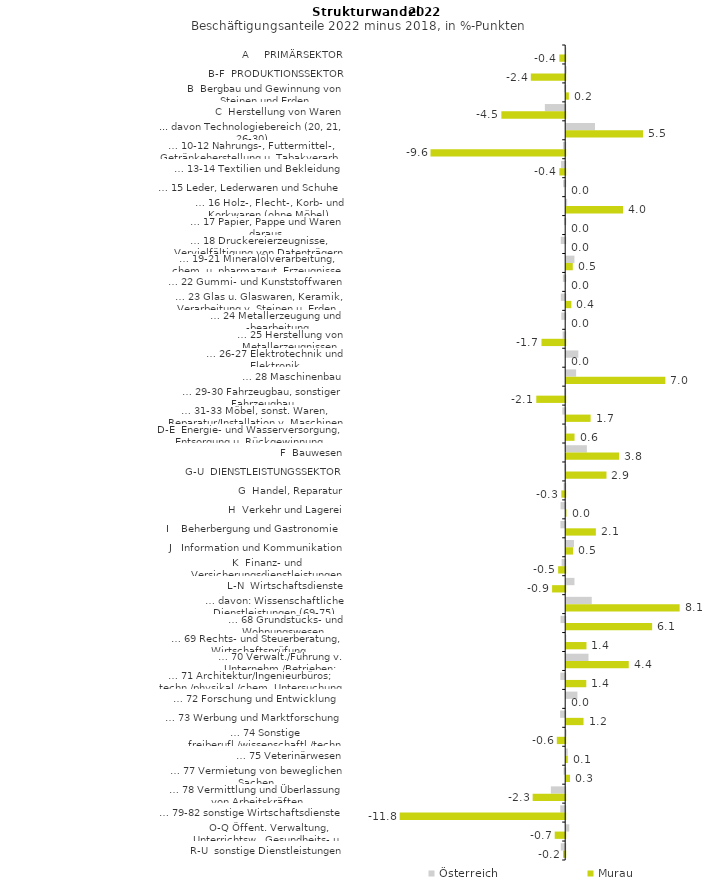
| Category | Österreich | Murau |
|---|---|---|
| A     PRIMÄRSEKTOR | 0.004 | -0.418 |
| B-F  PRODUKTIONSSEKTOR | 0.036 | -2.443 |
| B  Bergbau und Gewinnung von Steinen und Erden | -0.063 | 0.189 |
| C  Herstellung von Waren | -1.445 | -4.534 |
| ... davon Technologiebereich (20, 21, 26-30) | 2.047 | 5.455 |
| … 10-12 Nahrungs-, Futtermittel-, Getränkeherstellung u. Tabakverarb. | -0.163 | -9.565 |
| … 13-14 Textilien und Bekleidung | -0.292 | -0.417 |
| … 15 Leder, Lederwaren und Schuhe | -0.15 | 0 |
| … 16 Holz-, Flecht-, Korb- und Korkwaren (ohne Möbel)  | 0.068 | 4.033 |
| … 17 Papier, Pappe und Waren daraus  | -0.09 | 0 |
| … 18 Druckereierzeugnisse, Vervielfältigung von Datenträgern | -0.314 | 0 |
| … 19-21 Mineralölverarbeitung, chem. u. pharmazeut. Erzeugnisse | 0.584 | 0.467 |
| … 22 Gummi- und Kunststoffwaren | -0.168 | 0 |
| … 23 Glas u. Glaswaren, Keramik, Verarbeitung v. Steinen u. Erden  | -0.312 | 0.366 |
| … 24 Metallerzeugung und -bearbeitung | -0.276 | 0 |
| … 25 Herstellung von Metallerzeugnissen  | -0.185 | -1.684 |
| … 26-27 Elektrotechnik und Elektronik | 0.862 | 0 |
| … 28 Maschinenbau | 0.705 | 7.041 |
| … 29-30 Fahrzeugbau, sonstiger Fahrzeugbau | -0.066 | -2.053 |
| … 31-33 Möbel, sonst. Waren, Reparatur/Installation v. Maschinen | -0.204 | 1.734 |
| D-E  Energie- und Wasserversorgung, Entsorgung u. Rückgewinnung | 0.038 | 0.592 |
| F  Bauwesen | 1.469 | 3.753 |
| G-U  DIENSTLEISTUNGSSEKTOR | -0.04 | 2.861 |
| G  Handel, Reparatur | -0.115 | -0.274 |
| H  Verkehr und Lagerei | -0.33 | 0.022 |
| I    Beherbergung und Gastronomie | -0.34 | 2.106 |
| J   Information und Kommunikation | 0.551 | 0.483 |
| K  Finanz- und Versicherungsdienstleistungen | -0.255 | -0.503 |
| L-N  Wirtschaftsdienste | 0.586 | -0.932 |
| … davon: Wissenschaftliche Dienstleistungen (69-75) | 1.815 | 8.057 |
| … 68 Grundstücks- und Wohnungswesen  | -0.331 | 6.104 |
| … 69 Rechts- und Steuerberatung, Wirtschaftsprüfung | 0.008 | 1.44 |
| … 70 Verwalt./Führung v. Unternehm./Betrieben; Unternehmensberat. | 1.583 | 4.442 |
| … 71 Architektur/Ingenieurbüros; techn./physikal./chem. Untersuchung | -0.344 | 1.427 |
| … 72 Forschung und Entwicklung  | 0.797 | 0 |
| … 73 Werbung und Marktforschung | -0.361 | 1.23 |
| … 74 Sonstige freiberufl./wissenschaftl./techn. Tätigkeiten | 0.025 | -0.595 |
| … 75 Veterinärwesen | 0.108 | 0.112 |
| … 77 Vermietung von beweglichen Sachen  | -0.116 | 0.27 |
| … 78 Vermittlung und Überlassung von Arbeitskräften | -1.018 | -2.312 |
| … 79-82 sonstige Wirtschaftsdienste | -0.351 | -11.754 |
| O-Q Öffent. Verwaltung, Unterrichtsw., Gesundheits- u. Sozialwesen | 0.216 | -0.745 |
| R-U  sonstige Dienstleistungen | -0.314 | -0.157 |